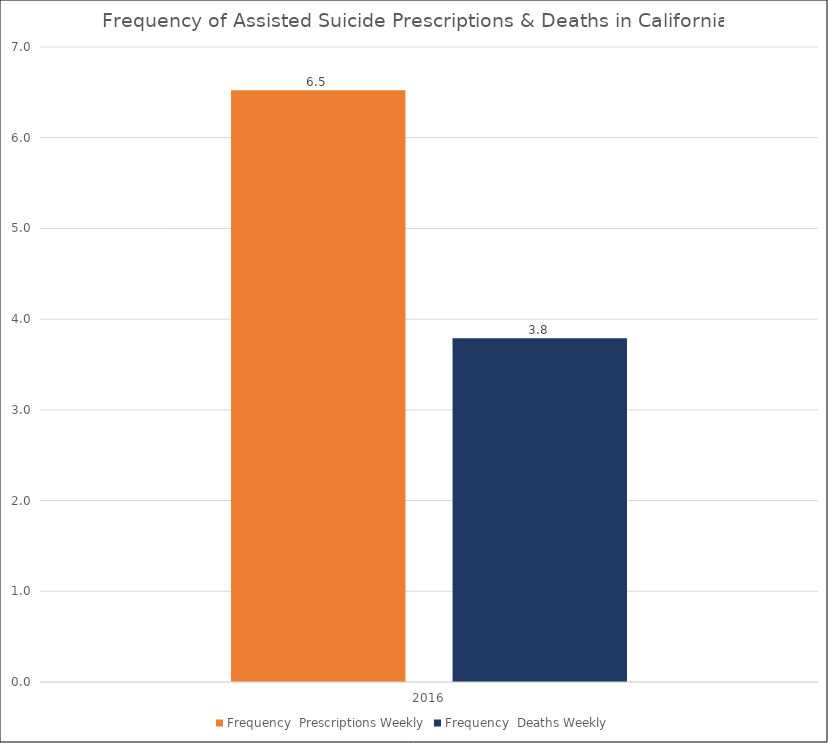
| Category | Frequency |
|---|---|
| 2016.0 | 3.79 |